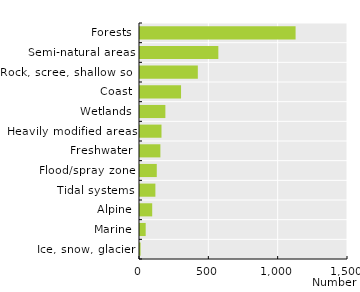
| Category | Number |
|---|---|
| Forests | 1122 |
| Semi-natural areas | 565 |
| Rock, scree, shallow soil | 417 |
| Coast | 296 |
| Wetlands | 183 |
| Heavily modified areas | 155 |
| Freshwater | 147 |
| Flood/spray zone | 121 |
| Tidal systems | 111 |
| Alpine | 88 |
| Marine | 41 |
| Ice, snow, glacier | 4 |